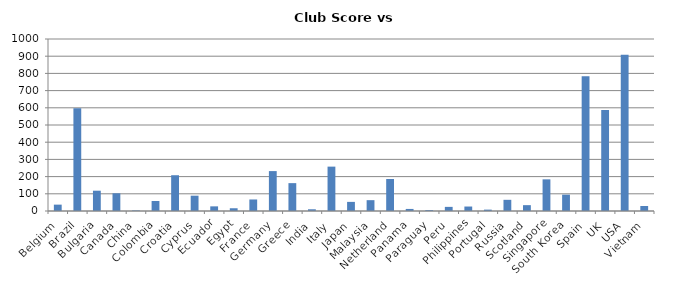
| Category | Series 0 |
|---|---|
| Belgium | 37 |
| Brazil | 598 |
| Bulgaria | 118 |
| Canada | 103 |
| China | 3 |
| Colombia | 58 |
| Croatia | 208 |
| Cyprus | 89 |
| Ecuador | 27 |
| Egypt | 16 |
| France | 67 |
| Germany | 232 |
| Greece | 162 |
| India | 10 |
| Italy | 258 |
| Japan | 53 |
| Malaysia | 63 |
| Netherland | 186 |
| Panama | 12 |
| Paraguay | 5 |
| Peru | 24 |
| Philippines | 26 |
| Portugal | 8 |
| Russia | 65 |
| Scotland | 34 |
| Singapore | 184 |
| South Korea | 95 |
| Spain | 784 |
| UK | 587 |
| USA | 909 |
| Vietnam | 29 |